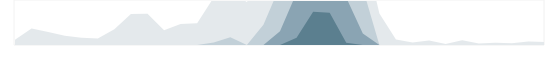
| Category | Техслужба | Series 1 | Series 2 | Series 3 |
|---|---|---|---|---|
| 0.333333333333333 | 86 | 0 | 0 | 0 |
| nan | 273 | 0 | 0 | 0 |
| nan | 218 | 0 | 0 | 0 |
| nan | 153 | 0 | 0 | 0 |
| 0.416666666666667 | 120 | 0 | 0 | 0 |
| nan | 109 | 0 | 0 | 0 |
| nan | 263 | 0 | 0 | 0 |
| nan | 518 | 0 | 0 | 0 |
| 0.5 | 519 | 0 | 0 | 0 |
| nan | 245 | 0 | 0 | 0 |
| nan | 349 | 0 | 0 | 0 |
| nan | 361 | 0 | 0 | 0 |
| 0.583333333333333 | 793 | 43 | 0 | 0 |
| nan | 881 | 131 | 0 | 0 |
| nan | 717 | 0 | 0 | 0 |
| nan | 1089 | 339 | 0 | 0 |
| 0.666666666666667 | 1731 | 981 | 231 | 0 |
| nan | 2369 | 1619 | 869 | 119 |
| nan | 2803 | 2053 | 1303 | 553 |
| nan | 2786 | 2036 | 1286 | 536 |
| 0.75 | 2289 | 1539 | 789 | 39 |
| nan | 1693 | 943 | 193 | 0 |
| nan | 525 | 0 | 0 | 0 |
| nan | 90 | 0 | 0 | 0 |
| 0.833333333333333 | 41 | 0 | 0 | 0 |
| nan | 74 | 0 | 0 | 0 |
| nan | 15 | 0 | 0 | 0 |
| nan | 81 | 0 | 0 | 0 |
| 0.916666666666667 | 24 | 0 | 0 | 0 |
| nan | 37 | 0 | 0 | 0 |
| nan | 30 | 0 | 0 | 0 |
| nan | 59 | 0 | 0 | 0 |
| 0.9993055555555556 | 48 | 0 | 0 | 0 |